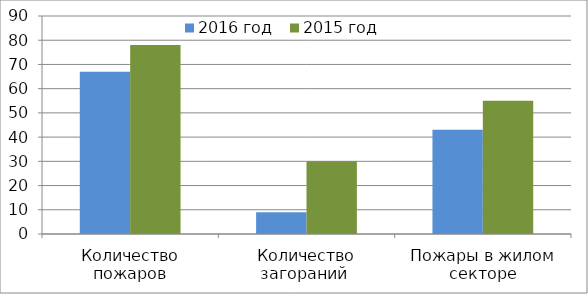
| Category | 2016 год | 2015 год |
|---|---|---|
| Количество пожаров | 67 | 78 |
| Количество загораний  | 9 | 30 |
| Пожары в жилом секторе | 43 | 55 |